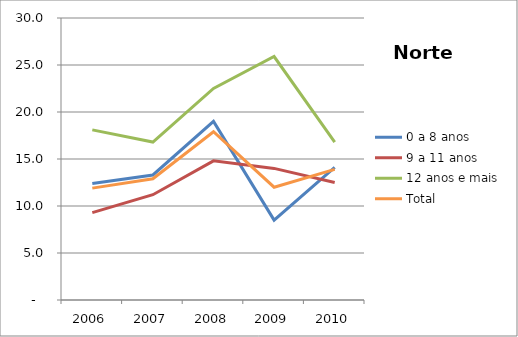
| Category | 0 a 8 anos | 9 a 11 anos | 12 anos e mais | Total |
|---|---|---|---|---|
| 2006.0 | 12.4 | 9.3 | 18.1 | 11.9 |
| 2007.0 | 13.3 | 11.2 | 16.8 | 12.9 |
| 2008.0 | 19 | 14.8 | 22.5 | 17.9 |
| 2009.0 | 8.5 | 14 | 25.9 | 12 |
| 2010.0 | 14.1 | 12.5 | 16.8 | 13.9 |